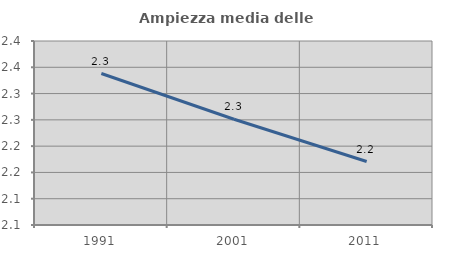
| Category | Ampiezza media delle famiglie |
|---|---|
| 1991.0 | 2.338 |
| 2001.0 | 2.251 |
| 2011.0 | 2.171 |